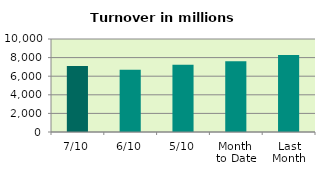
| Category | Series 0 |
|---|---|
| 7/10 | 7086.078 |
| 6/10 | 6698.927 |
| 5/10 | 7218.17 |
| Month 
to Date | 7596.307 |
| Last
Month | 8284.199 |